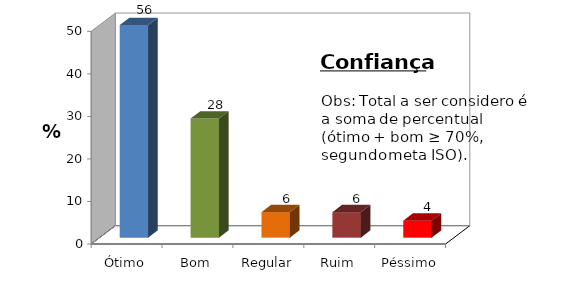
| Category | Series 0 |
|---|---|
| Ótimo | 56 |
| Bom | 28 |
| Regular | 6 |
| Ruim | 6 |
| Péssimo | 4 |